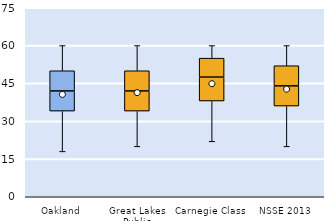
| Category | 25th | 50th | 75th |
|---|---|---|---|
| Oakland | 34 | 8 | 8 |
| Great Lakes Public | 34 | 8 | 8 |
| Carnegie Class | 38 | 9.5 | 7.5 |
| NSSE 2013 | 36 | 8 | 8 |